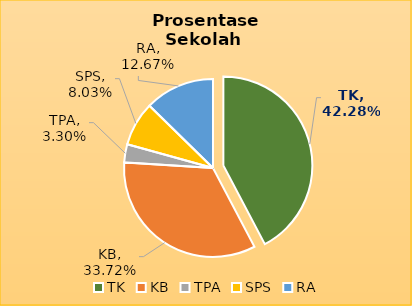
| Category | Series 0 |
|---|---|
| TK | 474 |
| KB | 378 |
| TPA | 37 |
| SPS | 90 |
| RA | 142 |